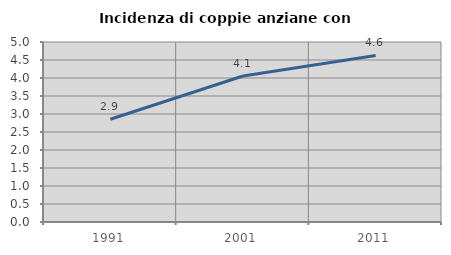
| Category | Incidenza di coppie anziane con figli |
|---|---|
| 1991.0 | 2.855 |
| 2001.0 | 4.056 |
| 2011.0 | 4.625 |